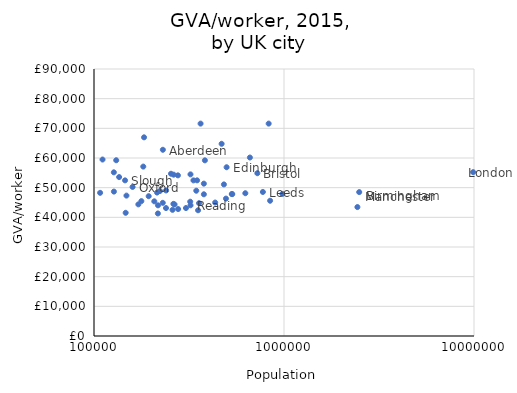
| Category | GVA growth |
|---|---|
| 230400.0 | 62771.66 |
| 183400.0 | 66967.23 |
| 239300.0 | 43126.9 |
| 181700.0 | 57103.88 |
| 320900.0 | 45270.89 |
| 2488200.0 | 48504.98 |
| 146800.0 | 41527.02 |
| 216900.0 | 41303.75 |
| 482800.0 | 51098.08 |
| 531200.0 | 47861.97 |
| 348700.0 | 52468.57 |
| 724000.0 | 54873.46 |
| 177500.0 | 45465.78 |
| 130900.0 | 59241.74 |
| 357200.0 | 44781.08 |
| 276500.0 | 54148.69 |
| 345400.0 | 48971 |
| 110900.0 | 59485.16 |
| 254300.0 | 54690.34 |
| 304800.0 | 43126.9 |
| 148200.0 | 47321.71 |
| 498800.0 | 56883.43 |
| 127300.0 | 48677.42 |
| 980800.0 | 47890.81 |
| 127200.0 | 55170.67 |
| 434300.0 | 44984.39 |
| 259000.0 | 42527.26 |
| 135600.0 | 53569.79 |
| 774100.0 | 48546.24 |
| 495000.0 | 46313.23 |
| 625800.0 | 48126.24 |
| 214700.0 | 55226.65 |
| 2434100.0 | 48351.93 |
| 230100.0 | 43460.87 |
| 469600.0 | 44886.33 |
| 261800.0 | 64784.56 |
| 845000.0 | 44536.77 |
| 239600.0 | 45594.88 |
| 222500.0 | 49058.9 |
| 265500.0 | 48881.07 |
| 661600.0 | 44326.85 |
| 159600.0 | 60161.35 |
| 194000.0 | 50246.47 |
| 262700.0 | 47124.17 |
| 534200.0 | 54378.7 |
| 363900.0 | 47826.47 |
| 322100.0 | 71591.81 |
| 830500.0 | 44050.48 |
| 145700.0 | 71592.21 |
| 378600.0 | 52460.7 |
| 353000.0 | 51356.04 |
| 378700.0 | 42384.56 |
| 277200.0 | 47766.33 |
| 383400.0 | 42787.82 |
| 217200.0 | 59212.39 |
| 171200.0 | 44042.77 |
| 333800.0 | 44366.86 |
| 207700.0 | 52456.72 |
| 322000.0 | 45396.91 |
| 107700.0 | 54478.72 |
| 206900.0 | 48259.77 |